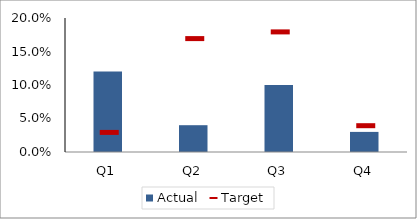
| Category | Actual |
|---|---|
| Q1 | 0.12 |
| Q2 | 0.04 |
| Q3 | 0.1 |
| Q4 | 0.03 |